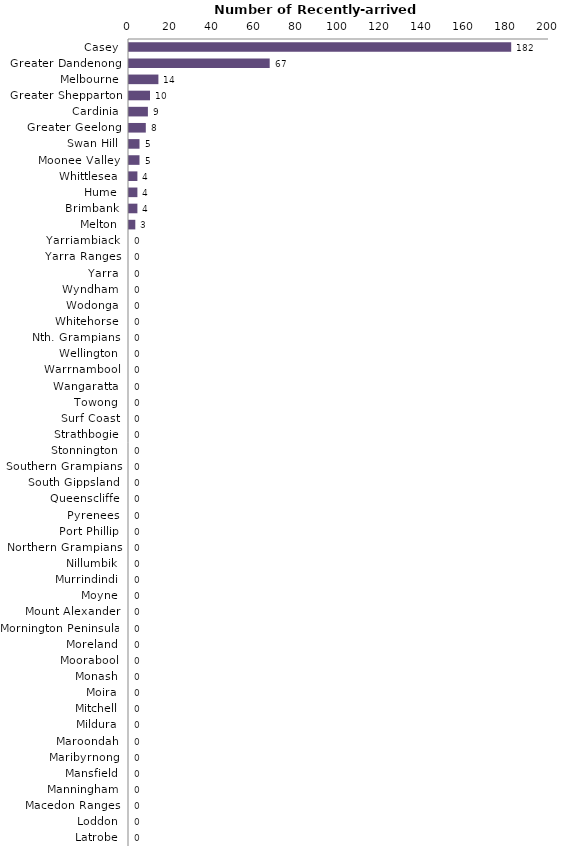
| Category | Series 0 |
|---|---|
| Casey | 182 |
| Greater Dandenong | 67 |
| Melbourne | 14 |
| Greater Shepparton | 10 |
| Cardinia | 9 |
| Greater Geelong | 8 |
| Swan Hill | 5 |
| Moonee Valley | 5 |
| Whittlesea | 4 |
| Hume | 4 |
| Brimbank | 4 |
| Melton | 3 |
| Yarriambiack | 0 |
| Yarra Ranges | 0 |
| Yarra | 0 |
| Wyndham | 0 |
| Wodonga | 0 |
| Whitehorse | 0 |
| Nth. Grampians | 0 |
| Wellington | 0 |
| Warrnambool | 0 |
| Wangaratta | 0 |
| Towong | 0 |
| Surf Coast | 0 |
| Strathbogie | 0 |
| Stonnington | 0 |
| Southern Grampians | 0 |
| South Gippsland | 0 |
| Queenscliffe | 0 |
| Pyrenees | 0 |
| Port Phillip | 0 |
| Northern Grampians | 0 |
| Nillumbik | 0 |
| Murrindindi | 0 |
| Moyne | 0 |
| Mount Alexander | 0 |
| Mornington Peninsula | 0 |
| Moreland | 0 |
| Moorabool | 0 |
| Monash | 0 |
| Moira | 0 |
| Mitchell | 0 |
| Mildura | 0 |
| Maroondah | 0 |
| Maribyrnong | 0 |
| Mansfield | 0 |
| Manningham | 0 |
| Macedon Ranges | 0 |
| Loddon | 0 |
| Latrobe | 0 |